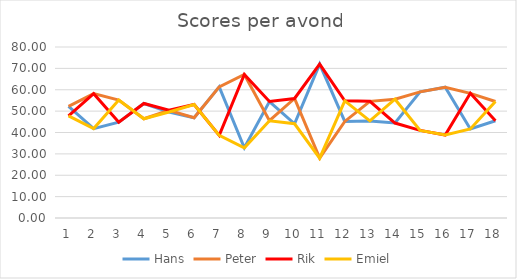
| Category | Hans | Peter | Rik | Emiel |
|---|---|---|---|---|
| 1.0 | 52.25 | 52.25 | 47.75 | 47.75 |
| 2.0 | 41.83 | 58.17 | 58.17 | 41.83 |
| 3.0 | 44.83 | 55.17 | 44.83 | 55.17 |
| 4.0 | 53.58 | 46.42 | 53.58 | 46.42 |
| 5.0 | 49.58 | 50.42 | 50.42 | 49.58 |
| 6.0 | 46.92 | 46.92 | 53.08 | 53.08 |
| 7.0 | 61.33 | 61.33 | 38.67 | 38.67 |
| 8.0 | 32.83 | 67.17 | 67.17 | 32.83 |
| 9.0 | 54.5 | 45.5 | 54.5 | 45.5 |
| 10.0 | 44.08 | 55.92 | 55.92 | 44.08 |
| 11.0 | 72 | 28 | 72 | 28 |
| 12.0 | 45.17 | 45.17 | 54.83 | 54.83 |
| 13.0 | 45.42 | 54.58 | 54.58 | 45.42 |
| 14.0 | 44.42 | 55.58 | 44.42 | 55.58 |
| 15.0 | 59 | 59 | 41 | 41 |
| 16.0 | 61.17 | 61.17 | 38.83 | 38.83 |
| 17.0 | 41.67 | 58.33 | 58.33 | 41.67 |
| 18.0 | 45.5 | 54.5 | 45.5 | 54.5 |